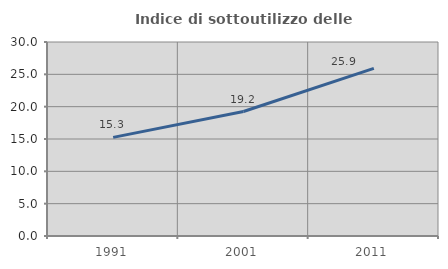
| Category | Indice di sottoutilizzo delle abitazioni  |
|---|---|
| 1991.0 | 15.252 |
| 2001.0 | 19.245 |
| 2011.0 | 25.929 |